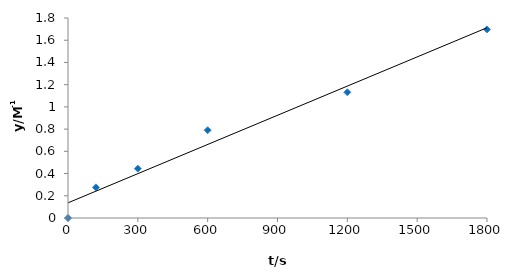
| Category | Series 0 |
|---|---|
| 0.0 | 0 |
| 120.0 | 0.276 |
| 300.0 | 0.444 |
| 600.0 | 0.79 |
| 1200.0 | 1.131 |
| 1800.0 | 1.697 |